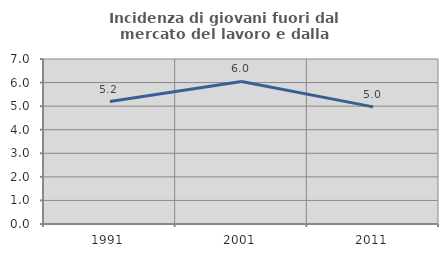
| Category | Incidenza di giovani fuori dal mercato del lavoro e dalla formazione  |
|---|---|
| 1991.0 | 5.195 |
| 2001.0 | 6.047 |
| 2011.0 | 4.969 |